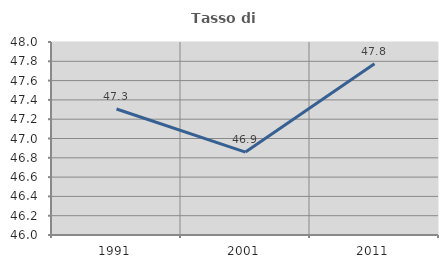
| Category | Tasso di occupazione   |
|---|---|
| 1991.0 | 47.305 |
| 2001.0 | 46.859 |
| 2011.0 | 47.776 |